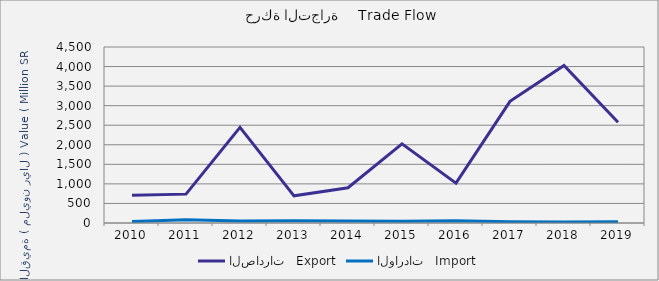
| Category | الصادرات   Export | الواردات   Import |
|---|---|---|
| 2010.0 | 712492312 | 40033651 |
| 2011.0 | 738257271 | 85322885 |
| 2012.0 | 2447251352 | 52013622 |
| 2013.0 | 694640404 | 57508289 |
| 2014.0 | 900991094 | 50062702 |
| 2015.0 | 2022234344 | 43954174 |
| 2016.0 | 1018622539 | 58308588 |
| 2017.0 | 3110561764 | 33271545 |
| 2018.0 | 4026516794 | 25766338 |
| 2019.0 | 2576377905 | 29981520 |